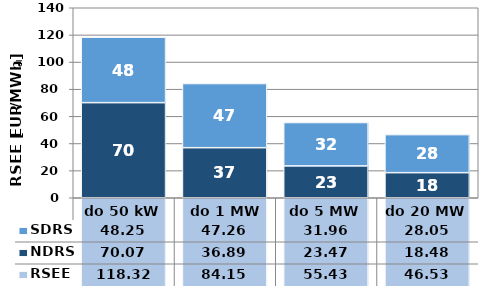
| Category | NDRS | SDRS |
|---|---|---|
| do 50 kW | 70.07 | 48.25 |
|  do 1 MW | 36.89 | 47.26 |
| do 5 MW | 23.47 | 31.96 |
| do 20 MW | 18.48 | 28.05 |